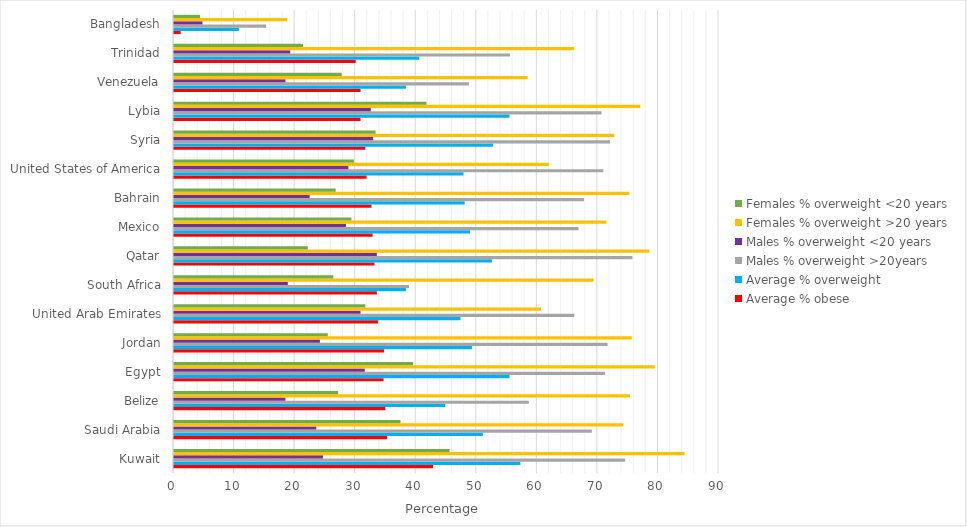
| Category | Average % obese | Average % overweight | Males % overweight >20years | Males % overweight <20 years | Females % overweight >20 years | Females % overweight <20 years |
|---|---|---|---|---|---|---|
| Kuwait | 42.8 | 57.2 | 74.5 | 24.6 | 84.3 | 45.5 |
| Saudi Arabia | 35.2 | 51 | 69 | 23.5 | 74.2 | 37.4 |
| Belize | 34.9 | 44.8 | 58.6 | 18.4 | 75.3 | 27.1 |
| Egypt | 34.6 | 55.4 | 71.2 | 31.5 | 79.4 | 39.5 |
| Jordan | 34.7 | 49.2 | 71.6 | 24.1 | 75.6 | 25.4 |
| United Arab Emirates | 33.7 | 47.3 | 66.1 | 30.8 | 60.6 | 31.6 |
| South Africa | 33.5 | 38.3 | 38.8 | 18.8 | 69.3 | 26.3 |
| Qatar | 33.1 | 52.5 | 75.7 | 33.5 | 78.5 | 22.1 |
| Mexico | 32.8 | 48.9 | 66.8 | 28.4 | 71.4 | 29.3 |
| Bahrain | 32.6 | 48 | 67.7 | 22.4 | 75.2 | 26.7 |
| United States of America | 31.8 | 47.8 | 70.9 | 28.8 | 61.9 | 29.7 |
| Syria | 31.6 | 52.7 | 72 | 32.9 | 72.7 | 33.3 |
| Lybia | 30.8 | 55.4 | 70.6 | 32.5 | 77 | 41.7 |
| Venezuela | 30.8 | 38.3 | 48.7 | 18.4 | 58.4 | 27.7 |
| Trinidad | 30 | 40.5 | 55.5 | 19.2 | 66.1 | 21.3 |
| Bangladesh | 1.1 | 10.7 | 15.2 | 4.7 | 18.7 | 4.3 |